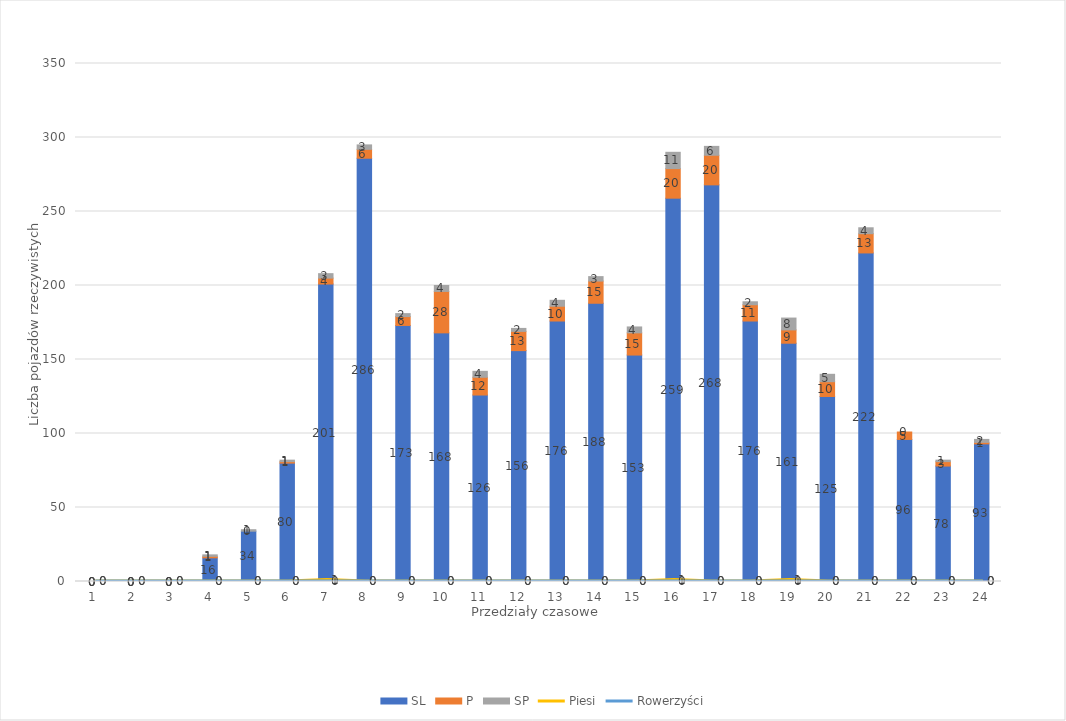
| Category | SL | P | SP |
|---|---|---|---|
| 0 | 0 | 0 | 0 |
| 1 | 0 | 0 | 0 |
| 2 | 0 | 0 | 0 |
| 3 | 16 | 1 | 1 |
| 4 | 34 | 0 | 1 |
| 5 | 80 | 1 | 1 |
| 6 | 201 | 4 | 3 |
| 7 | 286 | 6 | 3 |
| 8 | 173 | 6 | 2 |
| 9 | 168 | 28 | 4 |
| 10 | 126 | 12 | 4 |
| 11 | 156 | 13 | 2 |
| 12 | 176 | 10 | 4 |
| 13 | 188 | 15 | 3 |
| 14 | 153 | 15 | 4 |
| 15 | 259 | 20 | 11 |
| 16 | 268 | 20 | 6 |
| 17 | 176 | 11 | 2 |
| 18 | 161 | 9 | 8 |
| 19 | 125 | 10 | 5 |
| 20 | 222 | 13 | 4 |
| 21 | 96 | 5 | 0 |
| 22 | 78 | 3 | 1 |
| 23 | 93 | 1 | 2 |